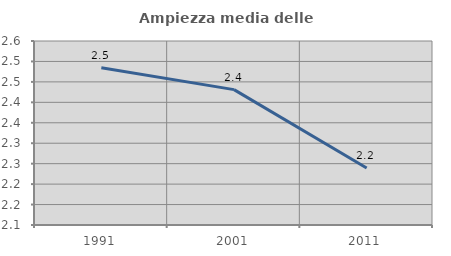
| Category | Ampiezza media delle famiglie |
|---|---|
| 1991.0 | 2.484 |
| 2001.0 | 2.431 |
| 2011.0 | 2.239 |